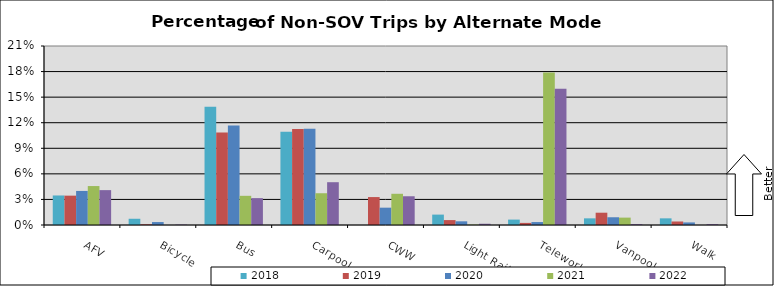
| Category | 2018 | 2019 | 2020 | 2021 | 2022 |
|---|---|---|---|---|---|
| AFV | 0.035 | 0.034 | 0.04 | 0.046 | 0.041 |
| Bicycle | 0.007 | 0.001 | 0.003 | 0 | 0 |
| Bus | 0.139 | 0.108 | 0.117 | 0.034 | 0.032 |
| Carpool | 0.109 | 0.113 | 0.113 | 0.037 | 0.05 |
| CWW | 0 | 0.033 | 0.02 | 0.037 | 0.034 |
| Light Rail | 0.012 | 0.006 | 0.004 | 0 | 0.001 |
| Telework | 0.006 | 0.002 | 0.003 | 0.179 | 0.16 |
| Vanpool | 0.008 | 0.014 | 0.009 | 0.009 | 0.001 |
| Walk | 0.008 | 0.004 | 0.003 | 0 | 0.001 |